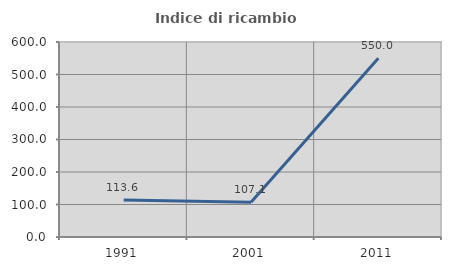
| Category | Indice di ricambio occupazionale  |
|---|---|
| 1991.0 | 113.636 |
| 2001.0 | 107.143 |
| 2011.0 | 550 |